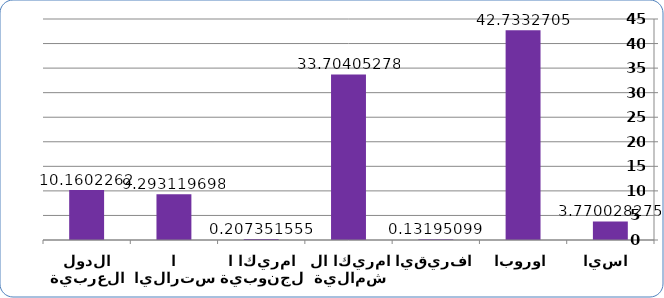
| Category | Series 0 |
|---|---|
| اسيا  | 3.77 |
| اوروبا | 42.733 |
| افريقيا | 0.132 |
| امريكا الشمالية | 33.704 |
| امريكا الجنوبية | 0.207 |
| استراليا | 9.293 |
| الدول العربية | 10.16 |